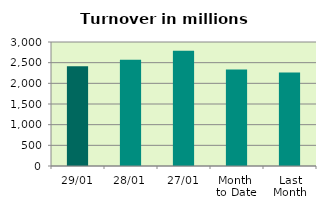
| Category | Series 0 |
|---|---|
| 29/01 | 2413.685 |
| 28/01 | 2570.167 |
| 27/01 | 2790.042 |
| Month 
to Date | 2334.838 |
| Last
Month | 2262.611 |